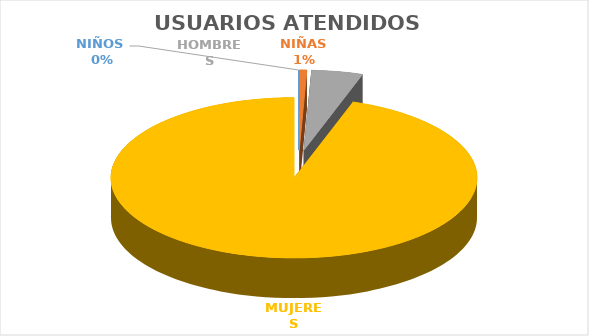
| Category | USUARIOS ATENDIDOS  |
|---|---|
| NIÑOS  | 0 |
| NIÑAS | 4 |
| HOMBRES | 27 |
| MUJERES | 565 |